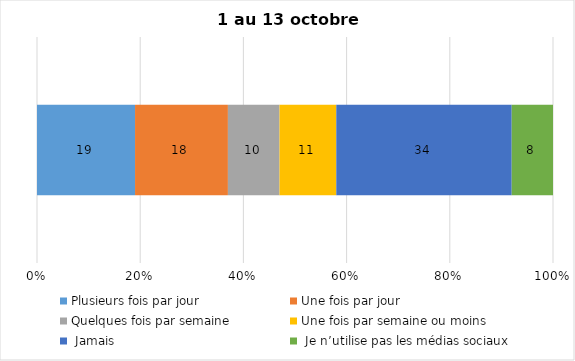
| Category | Plusieurs fois par jour | Une fois par jour | Quelques fois par semaine   | Une fois par semaine ou moins   |  Jamais   |  Je n’utilise pas les médias sociaux |
|---|---|---|---|---|---|---|
| 0 | 19 | 18 | 10 | 11 | 34 | 8 |